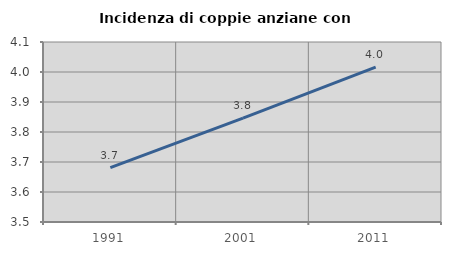
| Category | Incidenza di coppie anziane con figli |
|---|---|
| 1991.0 | 3.681 |
| 2001.0 | 3.846 |
| 2011.0 | 4.016 |